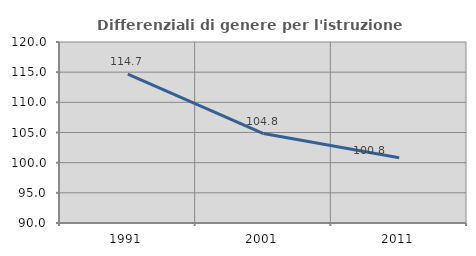
| Category | Differenziali di genere per l'istruzione superiore |
|---|---|
| 1991.0 | 114.686 |
| 2001.0 | 104.831 |
| 2011.0 | 100.806 |